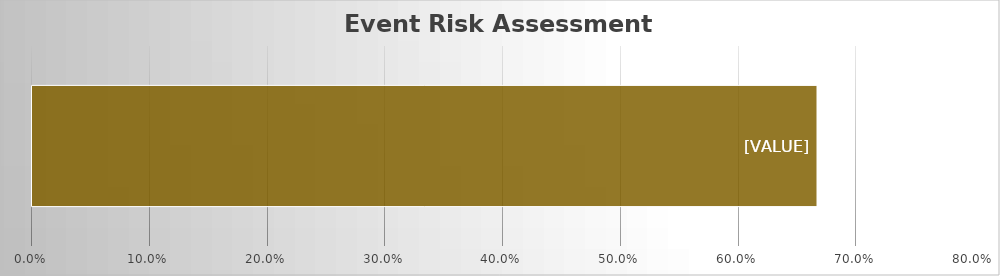
| Category | Risk Assessment |
|---|---|
| 0 | 0.667 |